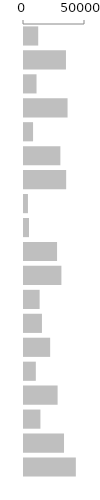
| Category | Per capita GDP (PPP) |
|---|---|
| 0 | 11647 |
| 1 | 34383 |
| 2 | 10279 |
| 3 | 35715 |
| 4 | 7418 |
| 5 | 29820 |
| 6 | 34573 |
| 7 | 3233 |
| 8 | 4094 |
| 9 | 27093 |
| 10 | 30660 |
| 11 | 12814 |
| 12 | 14714 |
| 13 | 21430 |
| 14 | 9678 |
| 15 | 27541 |
| 16 | 13468 |
| 17 | 32809 |
| 18 | 42486 |